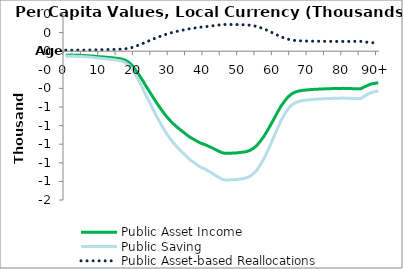
| Category | Public Asset Income | Public Saving | Public Asset-based Reallocations |
|---|---|---|---|
| 0 | -43.743 | -55.197 | 11.454 |
|  | -42.206 | -53.257 | 11.052 |
| 2 | -41.863 | -52.825 | 10.962 |
| 3 | -44.588 | -56.263 | 11.675 |
| 4 | -44.898 | -56.655 | 11.757 |
| 5 | -46.036 | -58.09 | 12.055 |
| 6 | -48.08 | -60.67 | 12.59 |
| 7 | -50.308 | -63.481 | 13.173 |
| 8 | -53.27 | -67.219 | 13.949 |
| 9 | -57.504 | -72.562 | 15.058 |
| 10 | -60.245 | -76.02 | 15.775 |
| 11 | -63.074 | -79.59 | 16.516 |
| 12 | -66.055 | -83.352 | 17.297 |
| 13 | -69.451 | -87.637 | 18.186 |
| 14 | -72.995 | -92.109 | 19.114 |
| 15 | -77.586 | -97.902 | 20.316 |
| 16 | -83.819 | -105.767 | 21.948 |
| 17 | -95.099 | -120.001 | 24.902 |
| 18 | -115.208 | -145.375 | 30.167 |
| 19 | -146.713 | -185.13 | 38.417 |
| 20 | -198.145 | -250.03 | 51.885 |
| 21 | -248.628 | -313.732 | 65.104 |
| 22 | -305.916 | -386.021 | 80.105 |
| 23 | -367.937 | -464.282 | 96.345 |
| 24 | -427.527 | -539.477 | 111.949 |
| 25 | -486.623 | -614.047 | 127.424 |
| 26 | -544.832 | -687.497 | 142.665 |
| 27 | -599.551 | -756.545 | 156.994 |
| 28 | -652.041 | -822.779 | 170.738 |
| 29 | -700.363 | -883.755 | 183.392 |
| 30 | -742.743 | -937.232 | 194.489 |
| 31 | -780.925 | -985.412 | 204.487 |
| 32 | -814.273 | -1027.493 | 213.219 |
| 33 | -844.681 | -1065.863 | 221.182 |
| 34 | -873.991 | -1102.847 | 228.856 |
| 35 | -904.005 | -1140.721 | 236.716 |
| 36 | -929.171 | -1172.477 | 243.306 |
| 37 | -950.457 | -1199.337 | 248.879 |
| 38 | -972.311 | -1226.913 | 254.602 |
| 39 | -990.772 | -1250.209 | 259.436 |
| 40 | -1002.777 | -1265.356 | 262.58 |
| 41 | -1019.694 | -1286.703 | 267.009 |
| 42 | -1036.34 | -1307.708 | 271.368 |
| 43 | -1056.429 | -1333.057 | 276.628 |
| 44 | -1073.841 | -1355.029 | 281.188 |
| 45 | -1091.168 | -1376.893 | 285.725 |
| 46 | -1098.461 | -1386.096 | 287.635 |
| 47 | -1096.827 | -1384.033 | 287.207 |
| 48 | -1095.893 | -1382.855 | 286.962 |
| 49 | -1094.505 | -1381.104 | 286.599 |
| 50 | -1090.101 | -1375.546 | 285.445 |
| 51 | -1086.146 | -1370.556 | 284.41 |
| 52 | -1079.41 | -1362.055 | 282.646 |
| 53 | -1067.74 | -1347.33 | 279.59 |
| 54 | -1044.681 | -1318.234 | 273.552 |
| 55 | -1015.054 | -1280.848 | 265.794 |
| 56 | -968.792 | -1222.472 | 253.68 |
| 57 | -919.482 | -1160.25 | 240.768 |
| 58 | -858.337 | -1083.094 | 224.757 |
| 59 | -792.592 | -1000.135 | 207.542 |
| 60 | -725.258 | -915.168 | 189.911 |
| 61 | -655.903 | -827.653 | 171.75 |
| 62 | -590.487 | -745.107 | 154.62 |
| 63 | -538.088 | -678.988 | 140.9 |
| 64 | -492.718 | -621.738 | 129.019 |
| 65 | -460.473 | -581.049 | 120.576 |
| 66 | -440.766 | -556.181 | 115.416 |
| 67 | -429.08 | -541.436 | 112.356 |
| 68 | -422.167 | -532.713 | 110.546 |
| 69 | -417.96 | -527.403 | 109.444 |
| 70 | -414.491 | -523.026 | 108.535 |
| 71 | -411.788 | -519.616 | 107.828 |
| 72 | -409.242 | -516.403 | 107.161 |
| 73 | -407.417 | -514.1 | 106.683 |
| 74 | -405.742 | -511.986 | 106.245 |
| 75 | -404.284 | -510.146 | 105.863 |
| 76 | -403.318 | -508.927 | 105.61 |
| 77 | -401.602 | -506.763 | 105.161 |
| 78 | -401.31 | -506.394 | 105.084 |
| 79 | -400.06 | -504.816 | 104.757 |
| 80 | -399.652 | -504.301 | 104.65 |
| 81 | -400.295 | -505.114 | 104.818 |
| 82 | -401.561 | -506.711 | 105.15 |
| 83 | -403.317 | -508.926 | 105.609 |
| 84 | -405.339 | -511.478 | 106.139 |
| 85 | -403.171 | -508.743 | 105.571 |
| 86 | -383.875 | -484.393 | 100.518 |
| 87 | -366.699 | -462.72 | 96.021 |
| 88 | -352.103 | -444.302 | 92.199 |
| 89 | -345.367 | -435.802 | 90.435 |
| 90+ | -339.025 | -427.799 | 88.774 |